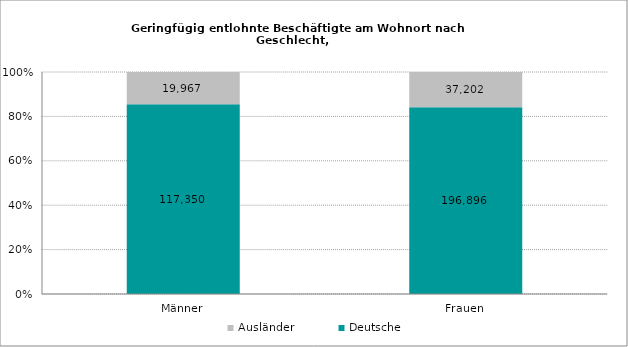
| Category | Deutsche | Ausländer |
|---|---|---|
| Männer | 117350 | 19967 |
| Frauen | 196896 | 37202 |